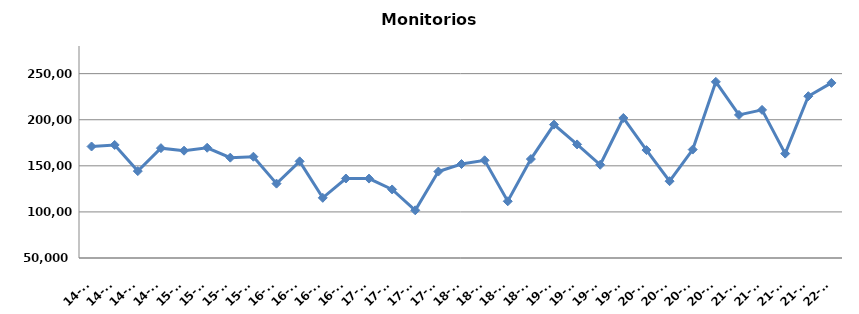
| Category | Monitorios ingresados |
|---|---|
| 14-T1 | 170973 |
| 14-T2 | 172648 |
| 14-T3 | 144262 |
| 14-T4 | 169174 |
| 15-T1 | 166433 |
| 15-T2 | 169612 |
| 15-T3 | 158859 |
| 15-T4 | 159890 |
| 16-T1 | 130680 |
| 16-T2 | 154860 |
| 16-T3 | 115269 |
| 16-T4 | 136245 |
| 17-T1 | 136155 |
| 17-T2 | 124382 |
| 17-T3 | 101751 |
| 17-T4 | 143788 |
| 18-T1 | 151974 |
| 18-T2 | 155991 |
| 18-T3 | 111544 |
| 18-T4 | 157337 |
| 19-T1 | 194715 |
| 19-T2 | 173225 |
| 19-T3 | 151156 |
| 19-T4 | 201895 |
| 20-T1 | 167095 |
| 20-T2 | 133351 |
| 20-T3 | 167630 |
| 20-T4 | 241119 |
| 21-T1 | 205212 |
| 21-T2 | 210679 |
| 21-T3 | 163259 |
| 21-T4 | 225536 |
| 22-T1 | 239972 |